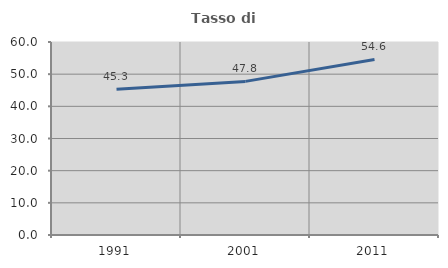
| Category | Tasso di occupazione   |
|---|---|
| 1991.0 | 45.339 |
| 2001.0 | 47.753 |
| 2011.0 | 54.588 |